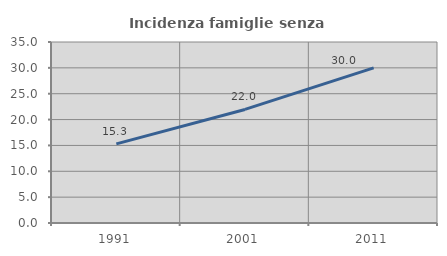
| Category | Incidenza famiglie senza nuclei |
|---|---|
| 1991.0 | 15.3 |
| 2001.0 | 21.959 |
| 2011.0 | 29.994 |